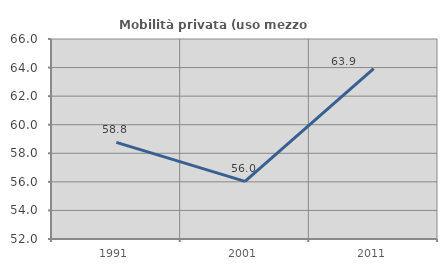
| Category | Mobilità privata (uso mezzo privato) |
|---|---|
| 1991.0 | 58.76 |
| 2001.0 | 56.033 |
| 2011.0 | 63.934 |